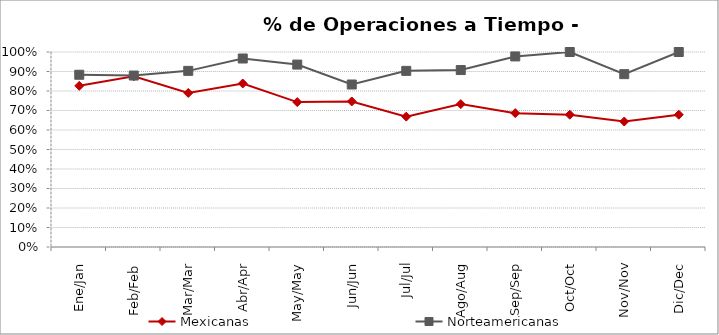
| Category | Mexicanas | Norteamericanas |
|---|---|---|
| Ene/Jan | 0.826 | 0.883 |
| Feb/Feb | 0.876 | 0.879 |
| Mar/Mar | 0.79 | 0.903 |
| Abr/Apr | 0.839 | 0.967 |
| May/May | 0.743 | 0.935 |
| Jun/Jun | 0.746 | 0.833 |
| Jul/Jul | 0.668 | 0.903 |
| Ago/Aug | 0.733 | 0.907 |
| Sep/Sep | 0.686 | 0.977 |
| Oct/Oct | 0.678 | 1 |
| Nov/Nov | 0.644 | 0.886 |
| Dic/Dec | 0.678 | 1 |